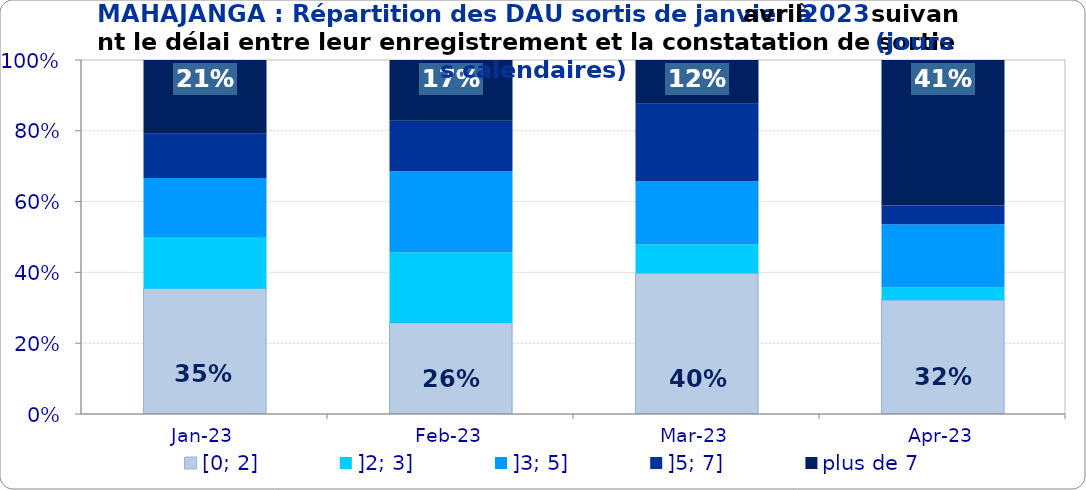
| Category | [0; 2] | ]2; 3] | ]3; 5] | ]5; 7] | plus de 7 |
|---|---|---|---|---|---|
| 2023-01-01 | 0.354 | 0.146 | 0.167 | 0.125 | 0.208 |
| 2023-02-01 | 0.257 | 0.2 | 0.229 | 0.143 | 0.171 |
| 2023-03-01 | 0.397 | 0.082 | 0.178 | 0.219 | 0.123 |
| 2023-04-01 | 0.321 | 0.036 | 0.179 | 0.054 | 0.411 |